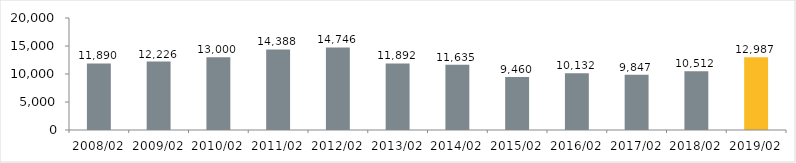
| Category | Series 0 |
|---|---|
| 2008/02 | 11890 |
| 2009/02 | 12226 |
| 2010/02 | 13000 |
| 2011/02 | 14388 |
| 2012/02 | 14746 |
| 2013/02 | 11892 |
| 2014/02 | 11635 |
| 2015/02 | 9460 |
| 2016/02 | 10132 |
| 2017/02 | 9847 |
| 2018/02 | 10512 |
| 2019/02 | 12987 |